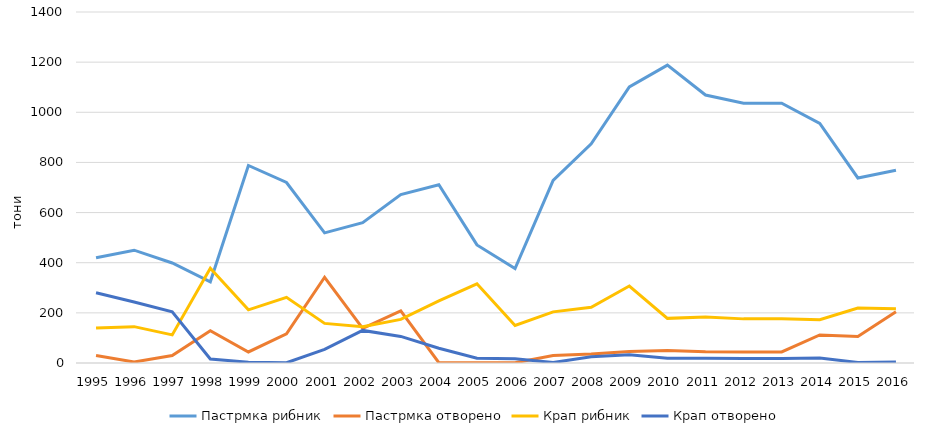
| Category | Пастрмка | Крап |
|---|---|---|
| 1995.0 | 30 | 280 |
| 1996.0 | 4 | 243 |
| 1997.0 | 30 | 204 |
| 1998.0 | 129 | 16 |
| 1999.0 | 44 | 3 |
| 2000.0 | 116 | 1 |
| 2001.0 | 342 | 54 |
| 2002.0 | 138 | 130 |
| 2003.0 | 208 | 106 |
| 2004.0 | 1 | 59 |
| 2005.0 | 1 | 19 |
| 2006.0 | 1 | 17 |
| 2007.0 | 30 | 2 |
| 2008.0 | 36 | 25 |
| 2009.0 | 46 | 33 |
| 2010.0 | 50 | 19 |
| 2011.0 | 45 | 19 |
| 2012.0 | 44 | 18 |
| 2013.0 | 44 | 18 |
| 2014.0 | 112 | 20 |
| 2015.0 | 106 | 2 |
| 2016.0 | 204 | 4 |